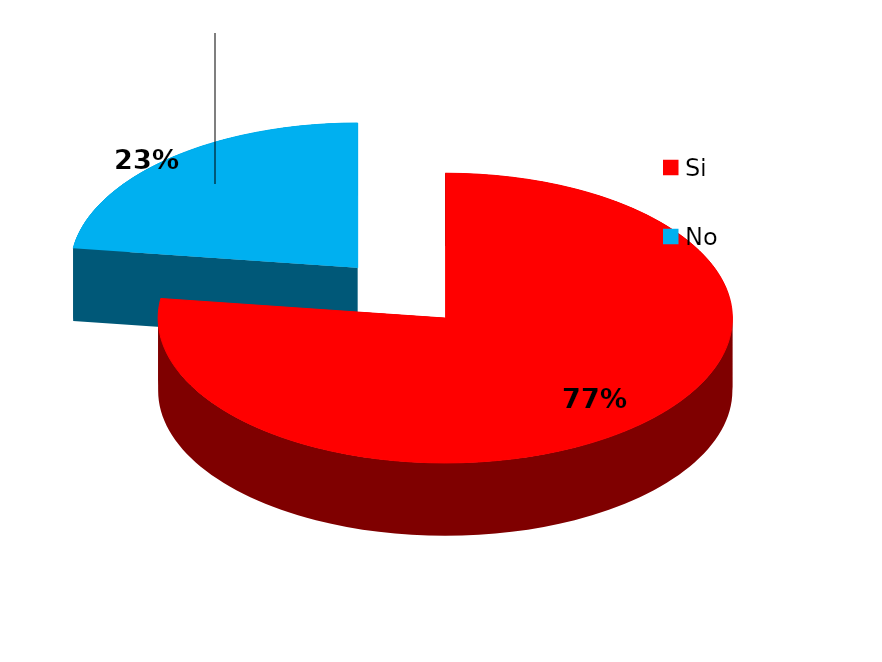
| Category | Series 0 |
|---|---|
| Si | 152 |
| No | 45 |